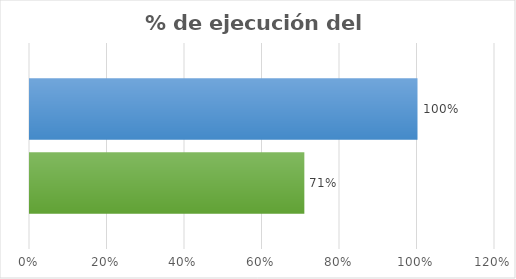
| Category | Series1 | Series 1 |
|---|---|---|
| 0 | 0.708 | 1 |